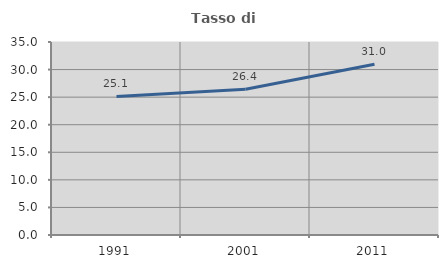
| Category | Tasso di occupazione   |
|---|---|
| 1991.0 | 25.135 |
| 2001.0 | 26.417 |
| 2011.0 | 30.967 |